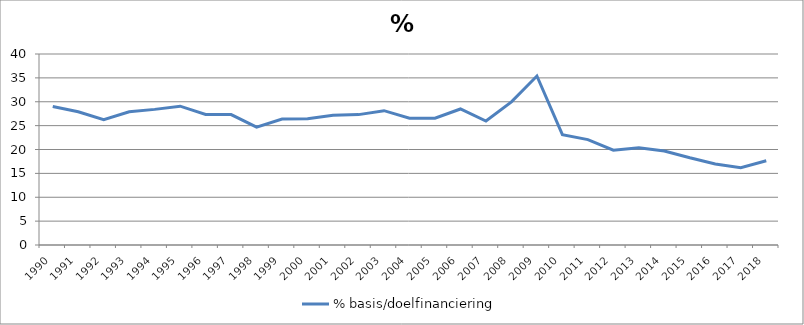
| Category | % basis/doelfinanciering |
|---|---|
| 1990.0 | 28.989 |
| 1991.0 | 27.897 |
| 1992.0 | 26.257 |
| 1993.0 | 27.902 |
| 1994.0 | 28.403 |
| 1995.0 | 29.071 |
| 1996.0 | 27.349 |
| 1997.0 | 27.319 |
| 1998.0 | 24.684 |
| 1999.0 | 26.38 |
| 2000.0 | 26.434 |
| 2001.0 | 27.152 |
| 2002.0 | 27.304 |
| 2003.0 | 28.131 |
| 2004.0 | 26.55 |
| 2005.0 | 26.555 |
| 2006.0 | 28.483 |
| 2007.0 | 25.966 |
| 2008.0 | 29.969 |
| 2009.0 | 35.387 |
| 2010.0 | 23.097 |
| 2011.0 | 22.077 |
| 2012.0 | 19.843 |
| 2013.0 | 20.368 |
| 2014.0 | 19.683 |
| 2015.0 | 18.258 |
| 2016.0 | 16.97 |
| 2017.0 | 16.196 |
| 2018.0 | 17.649 |